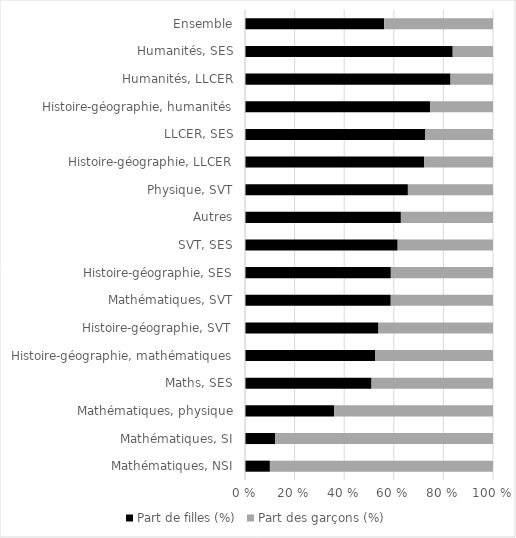
| Category | Part de filles (%) | Part des garçons (%) |
|---|---|---|
| Mathématiques, NSI | 10.034 | 89.966 |
| Mathématiques, SI | 12.103 | 87.897 |
| Mathématiques, physique | 35.973 | 64.027 |
| Maths, SES | 51.023 | 48.977 |
| Histoire-géographie, mathématiques | 52.42 | 47.58 |
| Histoire-géographie, SVT | 53.815 | 46.185 |
| Mathématiques, SVT | 58.775 | 41.225 |
| Histoire-géographie, SES | 58.807 | 41.193 |
| SVT, SES | 61.562 | 38.438 |
| Autres | 62.854 | 37.146 |
| Physique, SVT | 65.684 | 34.316 |
| Histoire-géographie, LLCER | 72.302 | 27.698 |
| LLCER, SES | 72.726 | 27.274 |
| Histoire-géographie, humanités | 74.668 | 25.332 |
| Humanités, LLCER | 82.88 | 17.12 |
| Humanités, SES | 83.764 | 16.236 |
| Ensemble | 56.112 | 43.888 |